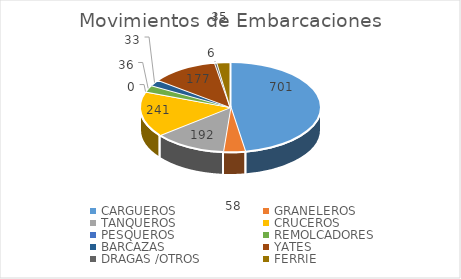
| Category | Series 0 |
|---|---|
| CARGUEROS | 701 |
| GRANELEROS | 58 |
| TANQUEROS | 192 |
| CRUCEROS | 241 |
| PESQUEROS | 0 |
| REMOLCADORES | 36 |
| BARCAZAS | 33 |
| YATES | 177 |
| DRAGAS /OTROS | 6 |
| FERRIE | 35 |